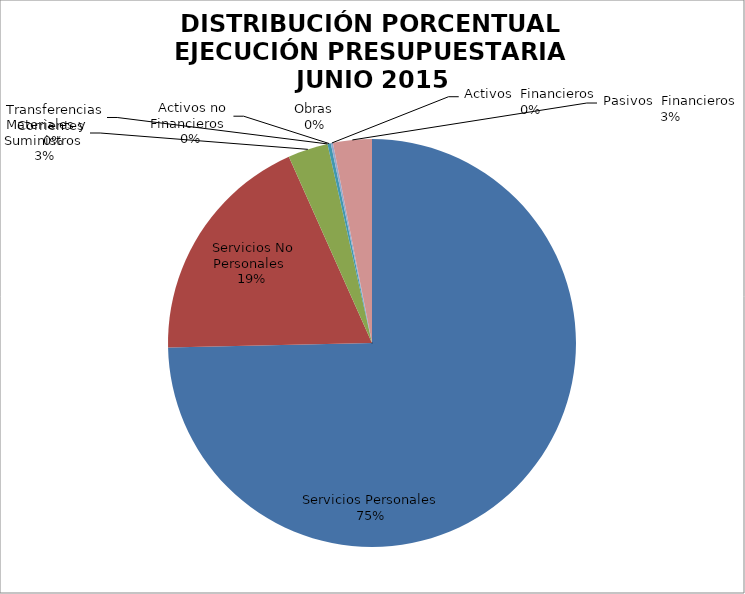
| Category | Series 0 | Series 1 |
|---|---|---|
| Servicios Personales | 10927867.36 | 0.795 |
| Servicios No Personales | 2732144.22 | 0.199 |
| Materiales y Suministros | 465313.57 | 0.034 |
| Transferencias Corrientes | 0 | 0 |
| Activos no Financieros | 38960.4 | 0.003 |
| Obras | 0 | 0 |
| Activos  Financieros | 24000 | 0.002 |
| Pasivos  Financieros | -449762.4 | -0.033 |